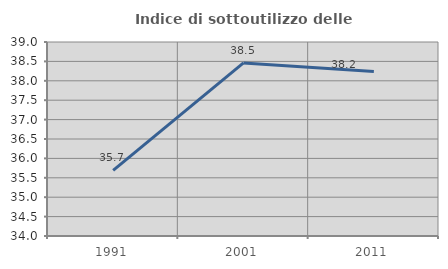
| Category | Indice di sottoutilizzo delle abitazioni  |
|---|---|
| 1991.0 | 35.693 |
| 2001.0 | 38.462 |
| 2011.0 | 38.239 |